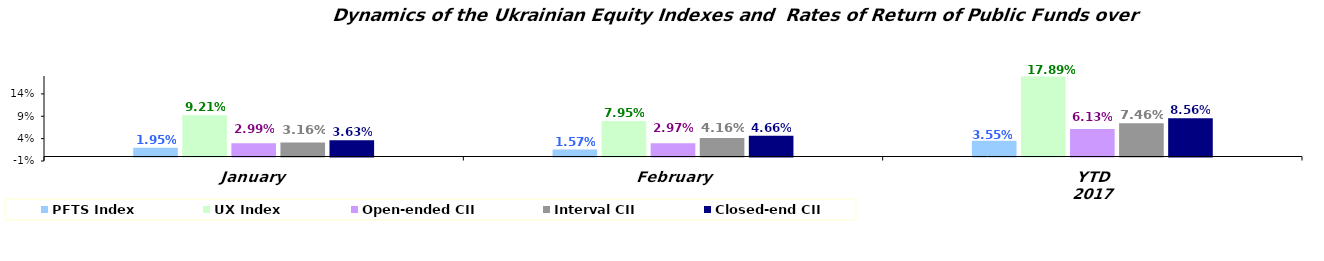
| Category | PFTS Index | UX Index | Open-ended CII | Interval CII | Closed-end CII |
|---|---|---|---|---|---|
| January | 0.019 | 0.092 | 0.03 | 0.032 | 0.036 |
| February | 0.016 | 0.08 | 0.03 | 0.042 | 0.047 |
| YTD 2017 | 0.035 | 0.179 | 0.061 | 0.075 | 0.086 |